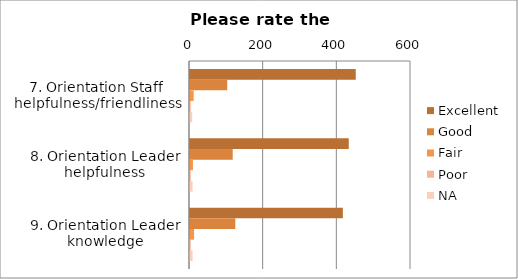
| Category | Excellent | Good | Fair | Poor | NA |
|---|---|---|---|---|---|
| 7. Orientation Staff helpfulness/friendliness | 450 | 101 | 10 | 2 | 6 |
| 8. Orientation Leader helpfulness | 431 | 116 | 8 | 2 | 7 |
| 9. Orientation Leader knowledge | 415 | 123 | 11 | 2 | 7 |